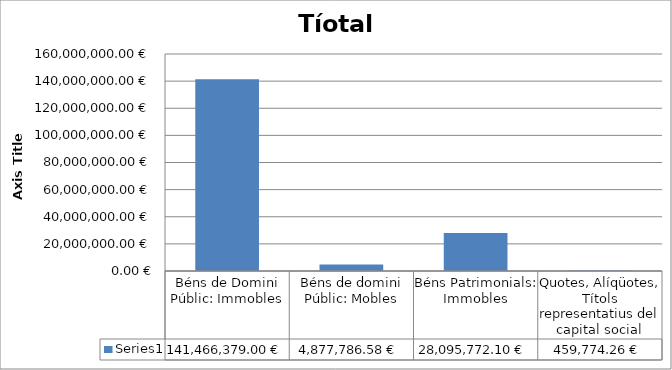
| Category | Series 0 |
|---|---|
| Béns de Domini Públic: Immobles | 141466379 |
| Béns de domini Públic: Mobles | 4877786.58 |
| Béns Patrimonials: Immobles | 28095772.1 |
| Quotes, Alíqüotes, Títols representatius del capital social | 459774.26 |